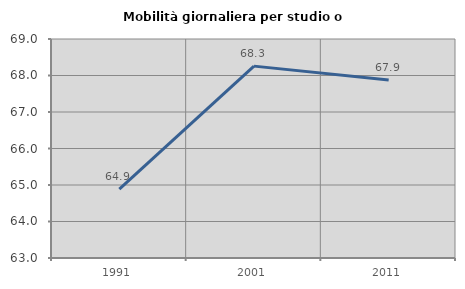
| Category | Mobilità giornaliera per studio o lavoro |
|---|---|
| 1991.0 | 64.888 |
| 2001.0 | 68.257 |
| 2011.0 | 67.876 |